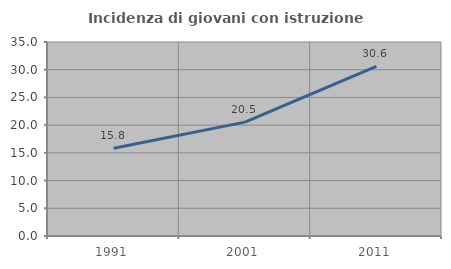
| Category | Incidenza di giovani con istruzione universitaria |
|---|---|
| 1991.0 | 15.838 |
| 2001.0 | 20.549 |
| 2011.0 | 30.592 |